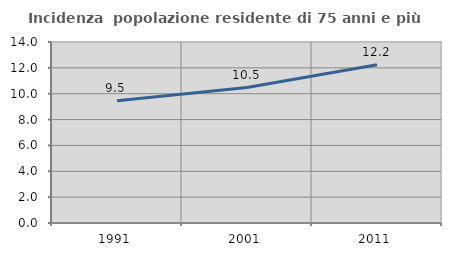
| Category | Incidenza  popolazione residente di 75 anni e più |
|---|---|
| 1991.0 | 9.45 |
| 2001.0 | 10.479 |
| 2011.0 | 12.244 |